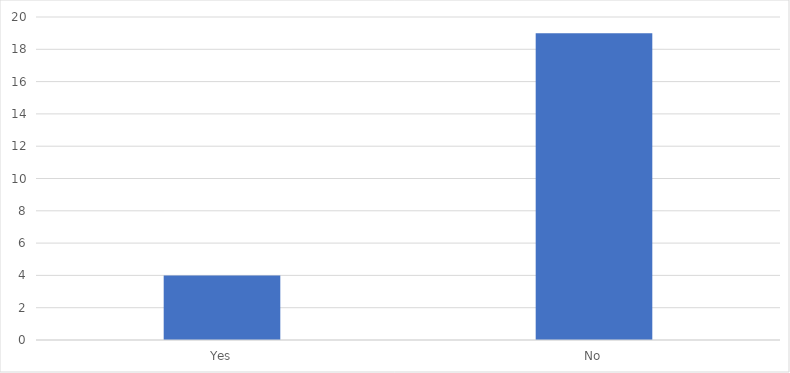
| Category | Number of Responses |
|---|---|
| Yes | 4 |
| No | 19 |